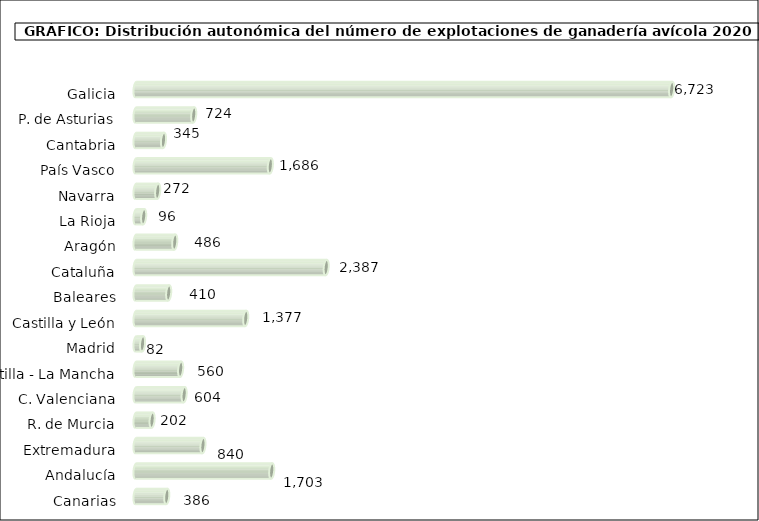
| Category | num. Explotaciones |
|---|---|
|   Galicia | 6723 |
|   P. de Asturias | 724 |
|   Cantabria | 345 |
|   País Vasco | 1686 |
|   Navarra | 272 |
|   La Rioja | 96 |
|   Aragón | 486 |
|   Cataluña | 2387 |
|   Baleares | 410 |
|   Castilla y León | 1377 |
|   Madrid | 82 |
|   Castilla - La Mancha | 560 |
|   C. Valenciana | 604 |
|   R. de Murcia | 202 |
|   Extremadura | 840 |
|   Andalucía | 1703 |
|   Canarias | 386 |